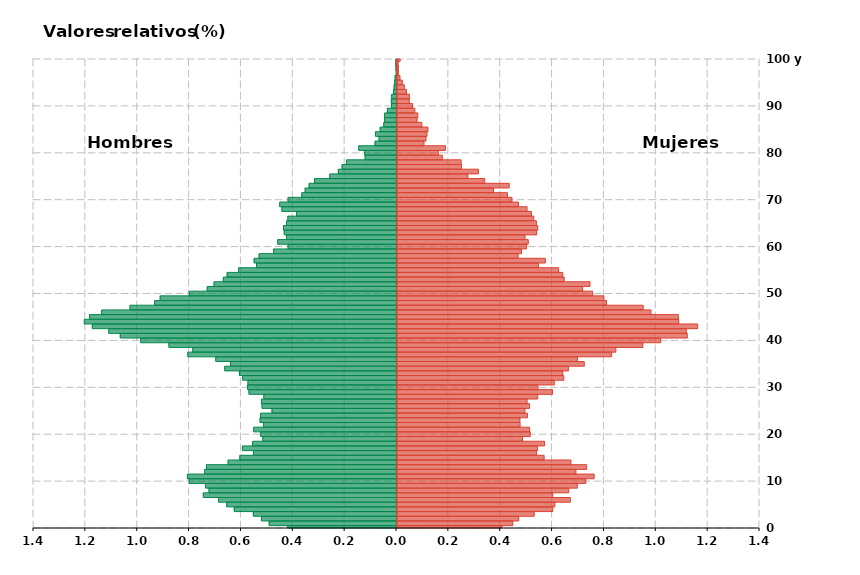
| Category | Hombres | Mujeres |
|---|---|---|
| 0 | -0.42 | 0.405 |
| 1 | -0.491 | 0.446 |
| 2 | -0.521 | 0.469 |
| 3 | -0.552 | 0.529 |
| 4 | -0.626 | 0.601 |
| 5 | -0.655 | 0.609 |
| 6 | -0.686 | 0.669 |
| 7 | -0.745 | 0.6 |
| 8 | -0.723 | 0.662 |
| 9 | -0.736 | 0.695 |
| 10 | -0.799 | 0.728 |
| 11 | -0.806 | 0.76 |
| 12 | -0.741 | 0.69 |
| 13 | -0.733 | 0.731 |
| 14 | -0.649 | 0.671 |
| 15 | -0.604 | 0.567 |
| 16 | -0.551 | 0.538 |
| 17 | -0.594 | 0.542 |
| 18 | -0.555 | 0.569 |
| 19 | -0.515 | 0.484 |
| 20 | -0.524 | 0.514 |
| 21 | -0.551 | 0.512 |
| 22 | -0.512 | 0.475 |
| 23 | -0.526 | 0.474 |
| 24 | -0.525 | 0.503 |
| 25 | -0.48 | 0.493 |
| 26 | -0.518 | 0.511 |
| 27 | -0.521 | 0.502 |
| 28 | -0.512 | 0.543 |
| 29 | -0.569 | 0.6 |
| 30 | -0.574 | 0.544 |
| 31 | -0.573 | 0.607 |
| 32 | -0.594 | 0.643 |
| 33 | -0.606 | 0.639 |
| 34 | -0.662 | 0.661 |
| 35 | -0.64 | 0.722 |
| 36 | -0.697 | 0.696 |
| 37 | -0.805 | 0.828 |
| 38 | -0.786 | 0.844 |
| 39 | -0.878 | 0.948 |
| 40 | -0.986 | 1.017 |
| 41 | -1.065 | 1.12 |
| 42 | -1.11 | 1.116 |
| 43 | -1.173 | 1.159 |
| 44 | -1.204 | 1.087 |
| 45 | -1.184 | 1.085 |
| 46 | -1.137 | 0.979 |
| 47 | -1.028 | 0.95 |
| 48 | -0.933 | 0.808 |
| 49 | -0.911 | 0.798 |
| 50 | -0.799 | 0.754 |
| 51 | -0.73 | 0.716 |
| 52 | -0.704 | 0.744 |
| 53 | -0.668 | 0.645 |
| 54 | -0.653 | 0.639 |
| 55 | -0.609 | 0.623 |
| 56 | -0.54 | 0.545 |
| 57 | -0.549 | 0.572 |
| 58 | -0.53 | 0.467 |
| 59 | -0.474 | 0.48 |
| 60 | -0.418 | 0.499 |
| 61 | -0.458 | 0.506 |
| 62 | -0.424 | 0.494 |
| 63 | -0.433 | 0.538 |
| 64 | -0.436 | 0.543 |
| 65 | -0.424 | 0.538 |
| 66 | -0.419 | 0.528 |
| 67 | -0.385 | 0.518 |
| 68 | -0.442 | 0.502 |
| 69 | -0.45 | 0.469 |
| 70 | -0.418 | 0.443 |
| 71 | -0.365 | 0.426 |
| 72 | -0.352 | 0.372 |
| 73 | -0.337 | 0.433 |
| 74 | -0.316 | 0.338 |
| 75 | -0.257 | 0.273 |
| 76 | -0.224 | 0.314 |
| 77 | -0.21 | 0.249 |
| 78 | -0.193 | 0.247 |
| 79 | -0.121 | 0.175 |
| 80 | -0.123 | 0.159 |
| 81 | -0.146 | 0.187 |
| 82 | -0.083 | 0.104 |
| 83 | -0.067 | 0.112 |
| 84 | -0.081 | 0.116 |
| 85 | -0.063 | 0.119 |
| 86 | -0.049 | 0.096 |
| 87 | -0.046 | 0.077 |
| 88 | -0.046 | 0.08 |
| 89 | -0.035 | 0.069 |
| 90 | -0.019 | 0.06 |
| 91 | -0.02 | 0.047 |
| 92 | -0.018 | 0.048 |
| 93 | -0.011 | 0.037 |
| 94 | -0.009 | 0.028 |
| 95 | -0.007 | 0.021 |
| 96 | -0.005 | 0.011 |
| 97 | -0.001 | 0.005 |
| 98 | -0.002 | 0.005 |
| 99 | -0.002 | 0.005 |
| 100 | -0.002 | 0.012 |